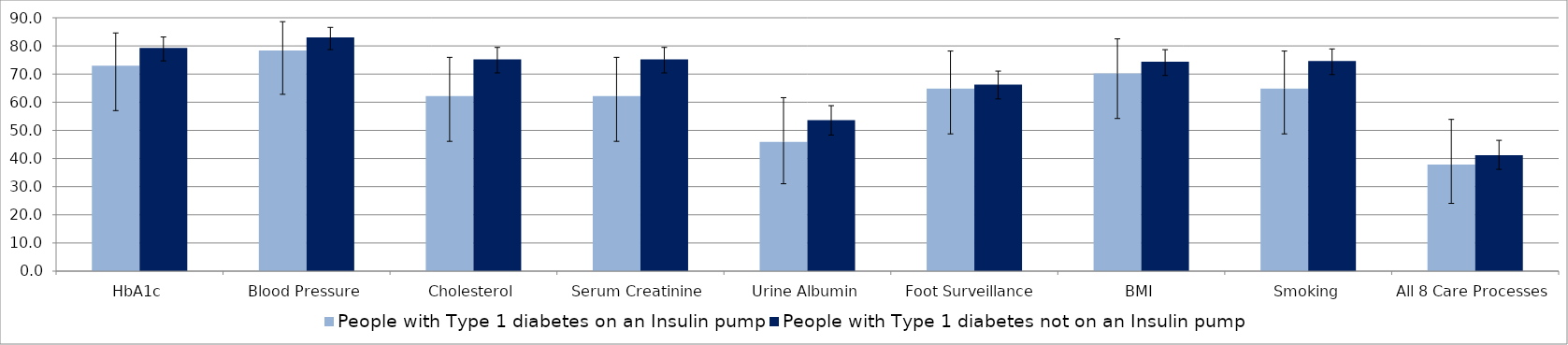
| Category | People with Type 1 diabetes on an Insulin pump | People with Type 1 diabetes not on an Insulin pump |
|---|---|---|
| HbA1c | 72.973 | 79.251 |
| Blood Pressure | 78.378 | 82.997 |
| Cholesterol | 62.162 | 75.216 |
| Serum Creatinine | 62.162 | 75.216 |
| Urine Albumin | 45.946 | 53.602 |
| Foot Surveillance  | 64.865 | 66.282 |
| BMI | 70.27 | 74.352 |
| Smoking | 64.865 | 74.64 |
| All 8 Care Processes | 37.838 | 41.21 |